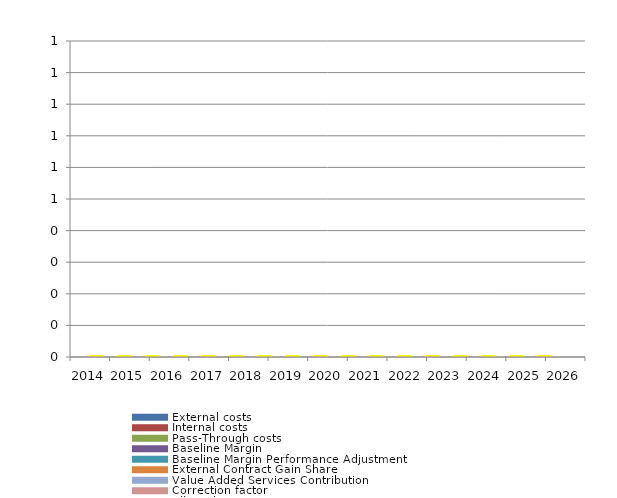
| Category | Allowed revenue |
|---|---|
| 0 | 0 |
| 1 | 0 |
| 2 | 0 |
| 3 | 0 |
| 4 | 0 |
| 5 | 0 |
| 6 | 0 |
| 7 | 0 |
| 8 | 0 |
| 9 | 0 |
| 10 | 0 |
| 11 | 0 |
| 12 | 0 |